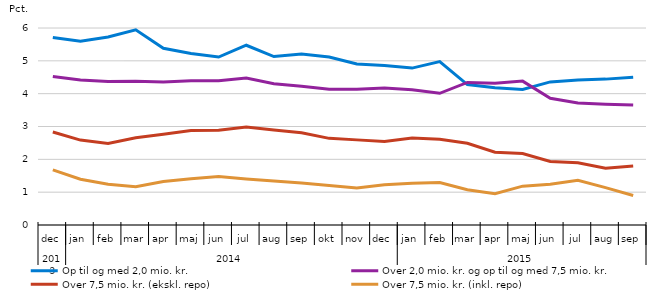
| Category | Op til og med 2,0 mio. kr. | Over 2,0 mio. kr. og op til og med 7,5 mio. kr. | Over 7,5 mio. kr. (ekskl. repo) | Over 7,5 mio. kr. (inkl. repo) |
|---|---|---|---|---|
| 0 | 5.708 | 4.522 | 2.833 | 1.678 |
| 1900-01-01 | 5.6 | 4.415 | 2.587 | 1.393 |
| 1900-01-02 | 5.727 | 4.369 | 2.482 | 1.239 |
| 1900-01-03 | 5.946 | 4.377 | 2.66 | 1.168 |
| 1900-01-04 | 5.381 | 4.358 | 2.764 | 1.327 |
| 1900-01-05 | 5.225 | 4.391 | 2.875 | 1.407 |
| 1900-01-06 | 5.116 | 4.397 | 2.886 | 1.478 |
| 1900-01-07 | 5.475 | 4.475 | 2.988 | 1.402 |
| 1900-01-08 | 5.131 | 4.302 | 2.894 | 1.338 |
| 1900-01-09 | 5.21 | 4.226 | 2.809 | 1.279 |
| 1900-01-10 | 5.117 | 4.136 | 2.638 | 1.204 |
| 1900-01-11 | 4.904 | 4.132 | 2.593 | 1.131 |
| 1900-01-12 | 4.861 | 4.171 | 2.547 | 1.228 |
| 1900-01-13 | 4.779 | 4.121 | 2.65 | 1.27 |
| 1900-01-14 | 4.977 | 4.012 | 2.615 | 1.293 |
| 1900-01-15 | 4.277 | 4.342 | 2.49 | 1.076 |
| 1900-01-16 | 4.18 | 4.317 | 2.214 | 0.955 |
| 1900-01-17 | 4.129 | 4.382 | 2.176 | 1.183 |
| 1900-01-18 | 4.359 | 3.862 | 1.937 | 1.239 |
| 1900-01-19 | 4.42 | 3.716 | 1.893 | 1.363 |
| 1900-01-20 | 4.443 | 3.677 | 1.726 | 1.137 |
| 1900-01-21 | 4.498 | 3.652 | 1.799 | 0.899 |